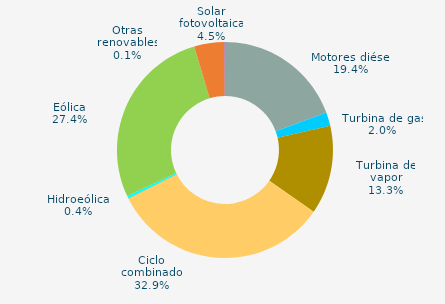
| Category | Series 0 |
|---|---|
| Motores diésel | 19.369 |
| Turbina de gas | 2.021 |
| Turbina de vapor | 13.283 |
| Ciclo combinado | 32.927 |
| Cogeneración | 0 |
| Hidráulica | 0.04 |
| Hidroeólica | 0.363 |
| Eólica | 27.403 |
| Solar fotovoltaica | 4.509 |
| Otras renovables | 0.085 |